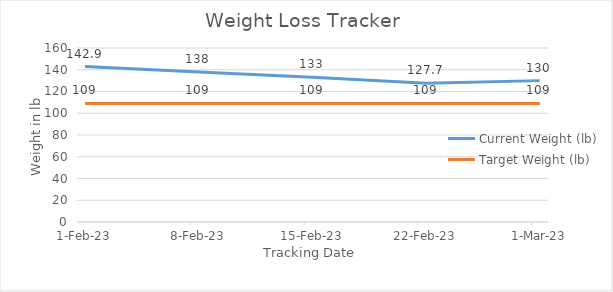
| Category | Current Weight (lb) | Target Weight (lb) |
|---|---|---|
| 2023-02-01 | 142.9 | 109 |
| 2023-02-08 | 138 | 109 |
| 2023-02-15 | 133 | 109 |
| 2023-02-22 | 127.7 | 109 |
| 2023-03-01 | 130 | 109 |